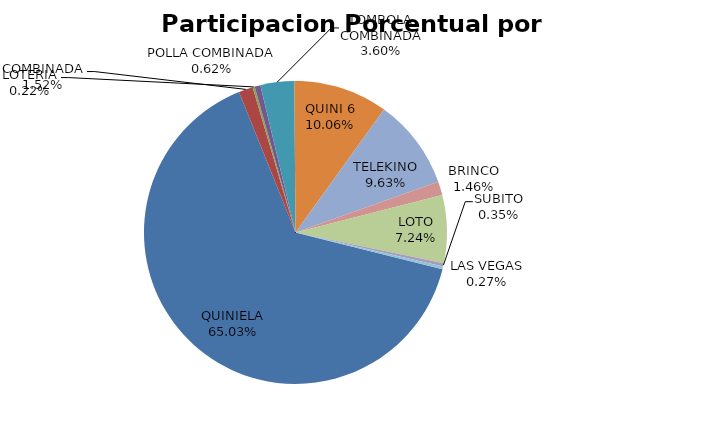
| Category | Series 0 |
|---|---|
| QUINIELA | 2494262 |
| COMBINADA | 58106 |
| LOTERIA | 8461 |
| POLLA COMBINADA | 23841 |
| TOMBOLA COMBINADA | 138233 |
| QUINI 6 | 385680 |
| TELEKINO | 369180 |
| BRINCO | 56070 |
| LOTO | 277711 |
| SUBITO | 13570 |
| LAS VEGAS | 10515 |